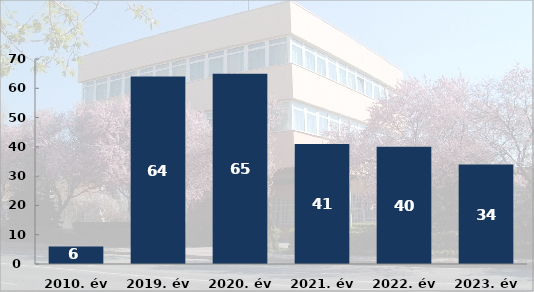
| Category | Elfogások száma |
|---|---|
| 2010. év | 6 |
| 2019. év | 64 |
| 2020. év | 65 |
| 2021. év | 41 |
| 2022. év | 40 |
| 2023. év | 34 |